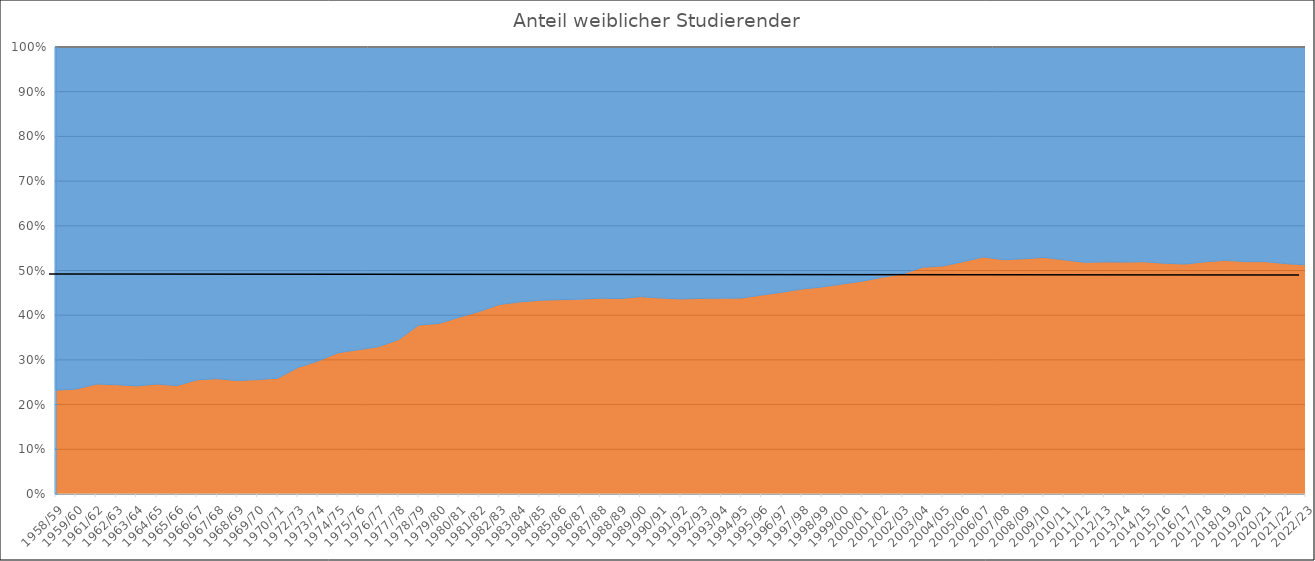
| Category | "weiblich" | "männlich" |
|---|---|---|
| 1958/59 | 629 | 2078 |
| 1959/60 | 785 | 2558 |
| 1961/62 | 1271 | 3897 |
| 1962/63 | 1407 | 4348 |
| 1963/64 | 1547 | 4850 |
| 1964/65 | 1593 | 4885 |
| 1965/66 | 1592 | 4974 |
| 1966/67 | 1817 | 5297 |
| 1967/68 | 1830 | 5264 |
| 1968/69 | 1950 | 5737 |
| 1969/70 | 2116 | 6152 |
| 1970/71 | 2285 | 6536 |
| 1972/73 | 2936 | 7441 |
| 1973/74 | 3170 | 7483 |
| 1974/75 | 3458 | 7485 |
| 1975/76 | 3722 | 7811 |
| 1976/77 | 4003 | 8142 |
| 1977/78 | 4269 | 8092 |
| 1978/79 | 5078 | 8351 |
| 1979/80 | 5095 | 8260 |
| 1980/81 | 5519 | 8441 |
| 1981/82 | 6038 | 8746 |
| 1982/83 | 6591 | 8956 |
| 1983/84 | 7045 | 9353 |
| 1984/85 | 7452 | 9742 |
| 1985/86 | 7581 | 9853 |
| 1986/87 | 7699 | 9963 |
| 1987/88 | 8005 | 10269 |
| 1988/89 | 8439 | 10863 |
| 1989/90 | 8640 | 10936 |
| 1990/91 | 8906 | 11406 |
| 1991/92 | 9094 | 11744 |
| 1992/93 | 9203 | 11825 |
| 1993/94 | 9205 | 11813 |
| 1994/95 | 8889 | 11394 |
| 1995/96 | 8915 | 11111 |
| 1996/97 | 8789 | 10690 |
| 1997/98 | 8631 | 10191 |
| 1998/99 | 8391 | 9722 |
| 1999/00 | 8223 | 9277 |
| 2000/01 | 8057 | 8865 |
| 2001/02 | 8184 | 8689 |
| 2002/03 | 8210 | 8467 |
| 2003/04 | 7842 | 7612 |
| 2004/05 | 7831 | 7521 |
| 2005/06 | 8074 | 7458 |
| 2006/07 | 8205 | 7273 |
| 2007/08 | 8081 | 7338 |
| 2008/09 | 8090 | 7283 |
| 2009/10 | 8678 | 7718 |
| 2010/11 | 9241 | 8398 |
| 2011/12 | 9475 | 8803 |
| 2012/13 | 9652 | 8940 |
| 2013/14 | 9516 | 8823 |
| 2014/15 | 9473 | 8762 |
| 2015/16 | 9249 | 8672 |
| 2016/17 | 8911 | 8406 |
| 2017/18 | 8793 | 8138 |
| 2018/19 | 8726 | 7969 |
| 2019/20 | 8753 | 8084 |
| 2020/21 | 8681 | 8020 |
| 2021/22 | 8596 | 8084 |
| 2022/23 | 8583 | 8166 |